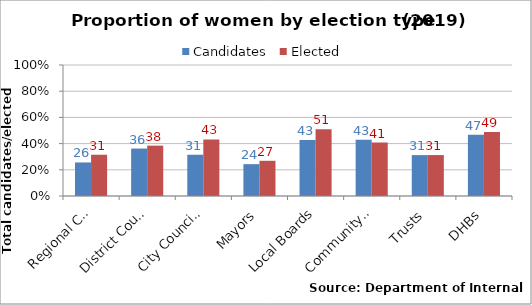
| Category | Candidates | Elected |
|---|---|---|
| Regional Councils | 0.256 | 0.315 |
| District Councils | 0.362 | 0.384 |
| City Councils | 0.315 | 0.432 |
| Mayors | 0.243 | 0.269 |
| Local Boards | 0.428 | 0.51 |
| Community boards | 0.43 | 0.408 |
| Trusts | 0.312 | 0.312 |
| DHBs | 0.468 | 0.489 |